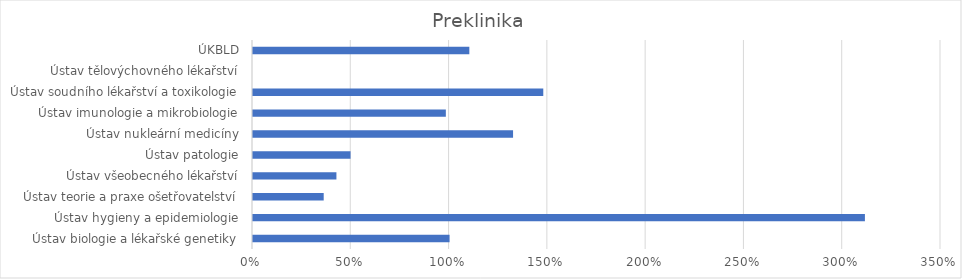
| Category | Series 0 |
|---|---|
| Ústav biologie a lékařské genetiky | 1 |
| Ústav hygieny a epidemiologie | 3.113 |
| Ústav teorie a praxe ošetřovatelství | 0.36 |
| Ústav všeobecného lékařství | 0.424 |
| Ústav patologie | 0.496 |
| Ústav nukleární medicíny | 1.323 |
| Ústav imunologie a mikrobiologie | 0.981 |
| Ústav soudního lékařství a toxikologie | 1.477 |
| Ústav tělovýchovného lékařství | 0 |
| ÚKBLD | 1.101 |